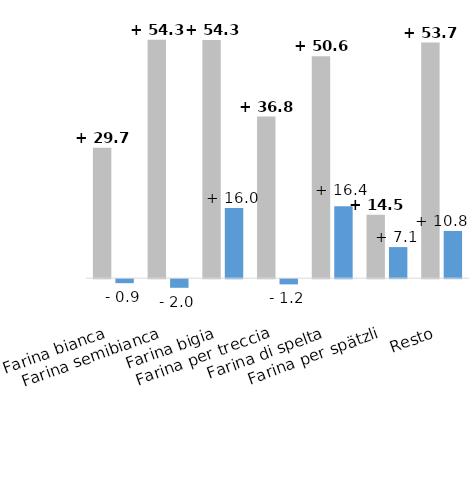
| Category | in % |
|---|---|
| Farina bianca | -0.92 |
| Farina semibianca | -1.972 |
| Farina bigia | 16.019 |
| Farina per treccia | -1.194 |
| Farina di spelta | 16.368 |
| Farina per spätzli | 7.083 |
| Resto | 10.765 |